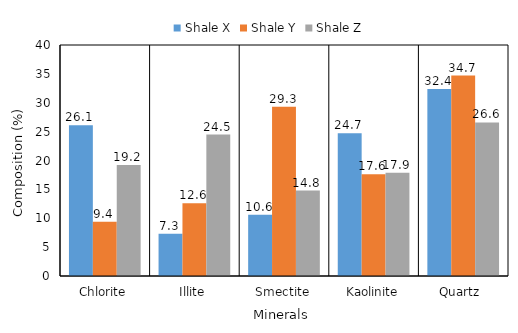
| Category | Shale X | Shale Y | Shale Z |
|---|---|---|---|
| Chlorite | 26.1 | 9.4 | 19.2 |
| Illite | 7.3 | 12.6 | 24.5 |
| Smectite | 10.6 | 29.3 | 14.8 |
| Kaolinite | 24.7 | 17.6 | 17.9 |
| Quartz  | 32.4 | 34.7 | 26.6 |